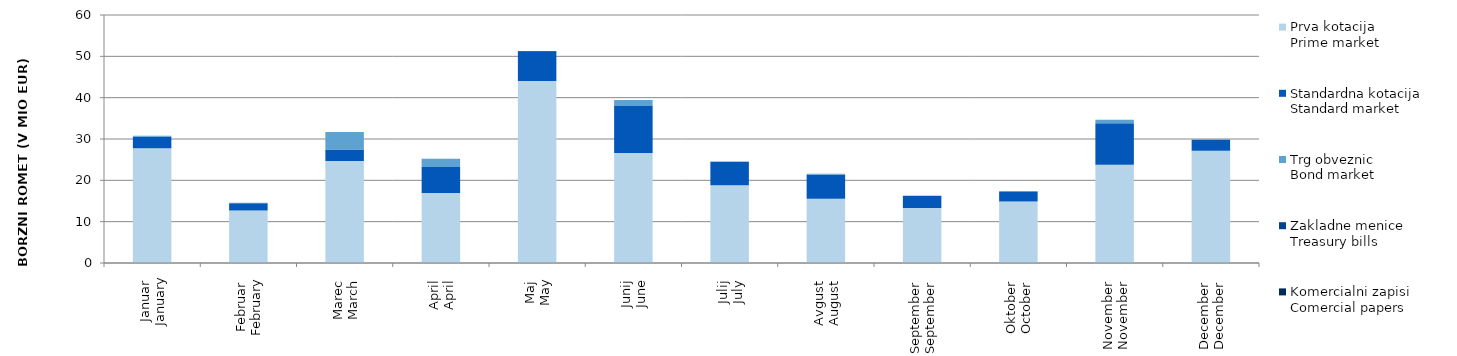
| Category | Prva kotacija
Prime market | Standardna kotacija
Standard market | Trg obveznic
Bond market | Zakladne menice
Treasury bills | Komercialni zapisi
Comercial papers |
|---|---|---|---|---|---|
| Januar
January | 27.745 | 2.796 | 0.249 | 0 | 0 |
| Februar
February | 12.685 | 1.784 | 0.118 | 0 | 0 |
| Marec
March | 24.676 | 2.813 | 4.174 | 0 | 0 |
| April
April | 16.942 | 6.272 | 2.01 | 0 | 0 |
| Maj
May | 44.02 | 7.1 | 0 | 0.145 | 0 |
| Junij
June | 26.612 | 11.39 | 1.425 | 0 | 0 |
| Julij
July | 18.826 | 5.646 | 0.075 | 0 | 0 |
| Avgust
August | 15.523 | 5.813 | 0.265 | 0 | 0 |
| September
September | 13.292 | 2.966 | 0.029 | 0 | 0 |
| Oktober
October | 14.908 | 2.252 | 0.23 | 0 | 0 |
| November
November | 23.743 | 10.076 | 0.813 | 0 | 0 |
| December
December | 27.153 | 2.661 | 0.095 | 0 | 0 |